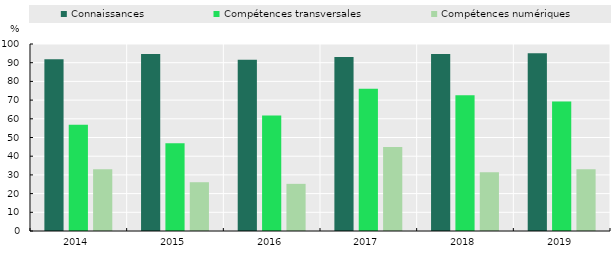
| Category | Connaissances | Compétences transversales | Compétences numériques |
|---|---|---|---|
| 2014.0 | 91.903 | 56.802 | 33.046 |
| 2015.0 | 94.644 | 46.898 | 26.086 |
| 2016.0 | 91.528 | 61.698 | 25.21 |
| 2017.0 | 93.064 | 76.046 | 44.903 |
| 2018.0 | 94.649 | 72.583 | 31.385 |
| 2019.0 | 95.03 | 69.298 | 33.026 |